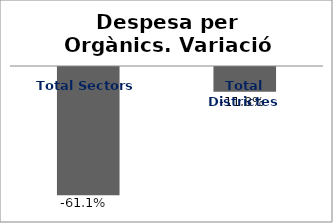
| Category | Series 0 |
|---|---|
| Total Sectors | -0.611 |
| Total Districtes | -0.118 |